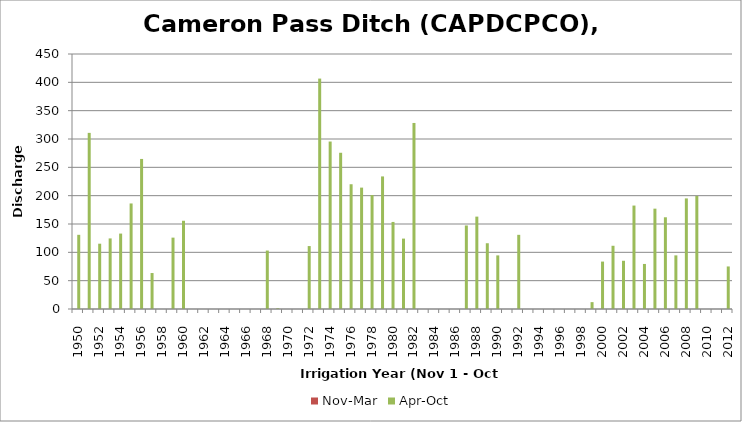
| Category | Nov-Mar | Apr-Oct |
|---|---|---|
| 1950.0 | 0 | 130.91 |
| 1951.0 | 0 | 310.81 |
| 1952.0 | 0 | 115.24 |
| 1953.0 | 0 | 124.56 |
| 1954.0 | 0 | 133.1 |
| 1955.0 | 0 | 186.25 |
| 1956.0 | 0 | 264.8 |
| 1957.0 | 0 | 63.47 |
| 1958.0 | 0 | 0 |
| 1959.0 | 0 | 125.95 |
| 1960.0 | 0 | 155.71 |
| 1961.0 | 0 | 0 |
| 1962.0 | 0 | 0 |
| 1963.0 | 0 | 0 |
| 1964.0 | 0 | 0 |
| 1965.0 | 0 | 0 |
| 1966.0 | 0 | 0 |
| 1967.0 | 0 | 0 |
| 1968.0 | 0 | 103.15 |
| 1969.0 | 0 | 1.45 |
| 1970.0 | 0 | 0 |
| 1971.0 | 0 | 0 |
| 1972.0 | 0 | 111.07 |
| 1973.0 | 0 | 406.62 |
| 1974.0 | 0 | 295.54 |
| 1975.0 | 0 | 275.71 |
| 1976.0 | 0 | 220.17 |
| 1977.0 | 0 | 214.21 |
| 1978.0 | 0 | 201.12 |
| 1979.0 | 0 | 233.96 |
| 1980.0 | 0 | 153.64 |
| 1981.0 | 0 | 124.23 |
| 1982.0 | 0 | 328.3 |
| 1983.0 | 0 | 0 |
| 1984.0 | 0 | 0 |
| 1985.0 | 0 | 0 |
| 1986.0 | 0 | 0 |
| 1987.0 | 0 | 147.39 |
| 1988.0 | 0 | 163.02 |
| 1989.0 | 0 | 116.05 |
| 1990.0 | 0 | 94.61 |
| 1991.0 | 0 | 0 |
| 1992.0 | 0 | 130.89 |
| 1993.0 | 0 | 0 |
| 1994.0 | 0 | 0 |
| 1995.0 | 0 | 0 |
| 1996.0 | 0 | 0 |
| 1997.0 | 0 | 0 |
| 1998.0 | 0 | 0 |
| 1999.0 | 0 | 12.12 |
| 2000.0 | 0 | 83.68 |
| 2001.0 | 0 | 111.58 |
| 2002.0 | 0 | 85.11 |
| 2003.0 | 0 | 182.54 |
| 2004.0 | 0 | 79.5 |
| 2005.0 | 0 | 177.07 |
| 2006.0 | 0 | 161.86 |
| 2007.0 | 0 | 94.65 |
| 2008.0 | 0 | 195.16 |
| 2009.0 | 0 | 199.52 |
| 2010.0 | 0 | 0 |
| 2011.0 | 0 | 0 |
| 2012.0 | 0 | 75.08 |